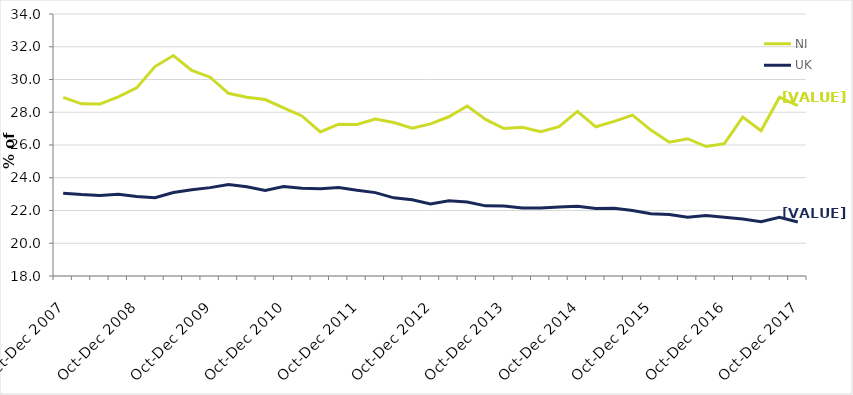
| Category | NI | UK |
|---|---|---|
| Oct-Dec 2007 | 28.904 | 23.058 |
| Jan-Mar 2008 | 28.512 | 22.974 |
| Apr-Jun 2008 | 28.5 | 22.917 |
| Jul-Sep 2008 | 28.937 | 22.996 |
| Oct-Dec 2008 | 29.489 | 22.851 |
| Jan-Mar 2009 | 30.792 | 22.786 |
| Apr-Jun 2009 | 31.467 | 23.097 |
| Jul-Sep 2009 | 30.556 | 23.27 |
| Oct-Dec 2009 | 30.141 | 23.397 |
| Jan-Mar 2010 | 29.156 | 23.588 |
| Apr-Jun 2010 | 28.921 | 23.451 |
| Jul-Sep 2010 | 28.774 | 23.219 |
| Oct-Dec 2010 | 28.271 | 23.468 |
| Jan-Mar 2011 | 27.775 | 23.36 |
| Apr-Jun 2011 | 26.796 | 23.329 |
| Jul-Sep 2011 | 27.274 | 23.402 |
| Oct-Dec 2011 | 27.25 | 23.233 |
| Jan-Mar 2012 | 27.586 | 23.091 |
| Apr-Jun 2012 | 27.377 | 22.772 |
| Jul-Sep 2012 | 27.027 | 22.654 |
| Oct-Dec 2012 | 27.29 | 22.399 |
| Jan-Mar 2013 | 27.724 | 22.591 |
| Apr-Jun 2013 | 28.384 | 22.524 |
| Jul-Sep 2013 | 27.56 | 22.283 |
| Oct-Dec 2013 | 27.003 | 22.276 |
| Jan-Mar 2014 | 27.078 | 22.149 |
| Apr-Jun 2014 | 26.812 | 22.156 |
| Jul-Sep 2014 | 27.121 | 22.206 |
| Oct-Dec 2014 | 28.053 | 22.253 |
| Jan-Mar 2015 | 27.111 | 22.118 |
| Apr-Jun 2015 | 27.442 | 22.136 |
| Jul-Sep 2015 | 27.82 | 22.003 |
| Oct-Dec 2015 | 26.909 | 21.8 |
| Jan-Mar 2016 | 26.171 | 21.755 |
| Apr-Jun 2016 | 26.384 | 21.596 |
| Jul-Sep 2016 | 25.907 | 21.693 |
| Oct-Dec 2016 | 26.081 | 21.593 |
| Jan-Mar 2017 | 27.701 | 21.48 |
| Apr-Jun 2017 | 26.871 | 21.309 |
| Jul-Sep 2017 | 28.916 | 21.58 |
| Oct-Dec 2017 | 28.406 | 21.302 |